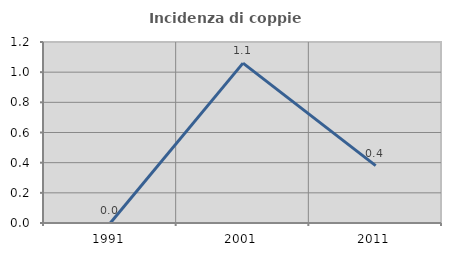
| Category | Incidenza di coppie miste |
|---|---|
| 1991.0 | 0 |
| 2001.0 | 1.06 |
| 2011.0 | 0.38 |